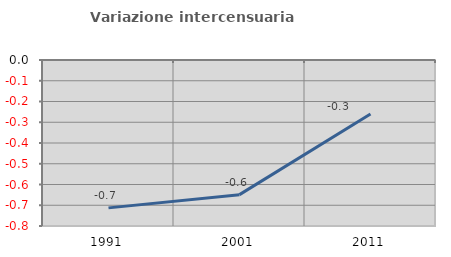
| Category | Variazione intercensuaria annua |
|---|---|
| 1991.0 | -0.713 |
| 2001.0 | -0.649 |
| 2011.0 | -0.26 |